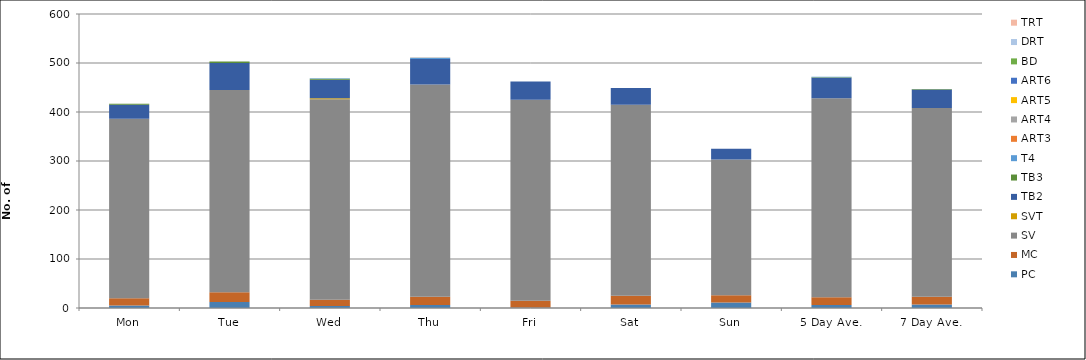
| Category | PC | MC | SV | SVT | TB2 | TB3 | T4 | ART3 | ART4 | ART5 | ART6 | BD | DRT | TRT |
|---|---|---|---|---|---|---|---|---|---|---|---|---|---|---|
| Mon | 5 | 15 | 366 | 0 | 29 | 2 | 0 | 0 | 0 | 0 | 0 | 0 | 0 | 0 |
| Tue | 12 | 20 | 413 | 0 | 55 | 3 | 0 | 0 | 0 | 0 | 0 | 0 | 0 | 0 |
| Wed | 4 | 13 | 409 | 2 | 38 | 2 | 1 | 0 | 0 | 0 | 0 | 0 | 0 | 0 |
| Thu | 6 | 17 | 433 | 0 | 52 | 0 | 2 | 0 | 1 | 0 | 0 | 0 | 0 | 0 |
| Fri | 1 | 14 | 410 | 0 | 37 | 0 | 0 | 0 | 0 | 0 | 0 | 0 | 0 | 0 |
| Sat | 7 | 18 | 390 | 0 | 34 | 0 | 0 | 0 | 0 | 0 | 0 | 0 | 0 | 0 |
| Sun | 11 | 15 | 277 | 0 | 22 | 0 | 0 | 0 | 0 | 0 | 0 | 0 | 0 | 0 |
| 5 Day Ave. | 6 | 16 | 406 | 0 | 42 | 1 | 1 | 0 | 0 | 0 | 0 | 0 | 0 | 0 |
| 7 Day Ave. | 7 | 16 | 385 | 0 | 38 | 1 | 0 | 0 | 0 | 0 | 0 | 0 | 0 | 0 |